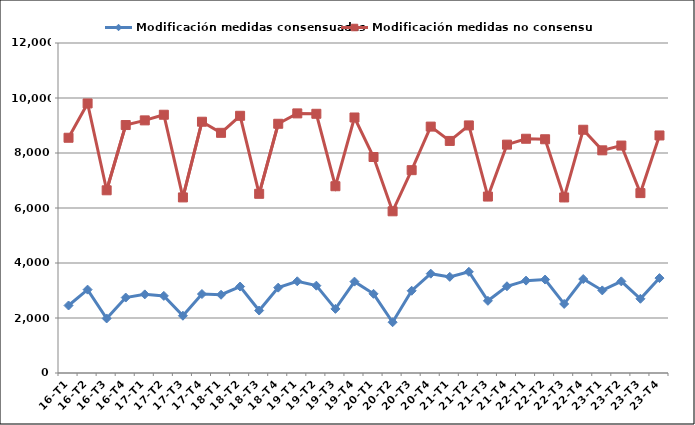
| Category | Modificación medidas consensuadas | Modificación medidas no consensuadas |
|---|---|---|
| 16-T1 | 2455 | 8554 |
| 16-T2 | 3032 | 9802 |
| 16-T3 | 1983 | 6644 |
| 16-T4 | 2744 | 9017 |
| 17-T1 | 2859 | 9186 |
| 17-T2 | 2804 | 9391 |
| 17-T3 | 2082 | 6385 |
| 17-T4 | 2872 | 9137 |
| 18-T1 | 2846 | 8734 |
| 18-T2 | 3144 | 9353 |
| 18-T3 | 2272 | 6516 |
| 18-T4 | 3104 | 9063 |
| 19-T1 | 3335 | 9440 |
| 19-T2 | 3176 | 9426 |
| 19-T3 | 2332 | 6792 |
| 19-T4 | 3323 | 9291 |
| 20-T1 | 2880 | 7854 |
| 20-T2 | 1846 | 5880 |
| 20-T3 | 2991 | 7376 |
| 20-T4 | 3612 | 8960 |
| 21-T1 | 3496 | 8439 |
| 21-T2 | 3680 | 9003 |
| 21-T3 | 2625 | 6416 |
| 21-T4 | 3154 | 8304 |
| 22-T1 | 3359 | 8518 |
| 22-T2 | 3398 | 8500 |
| 22-T3 | 2512 | 6384 |
| 22-T4 | 3417 | 8845 |
| 23-T1 | 3003 | 8097 |
| 23-T2 | 3332 | 8271 |
| 23-T3 | 2699 | 6542 |
| 23-T4 | 3451 | 8638 |